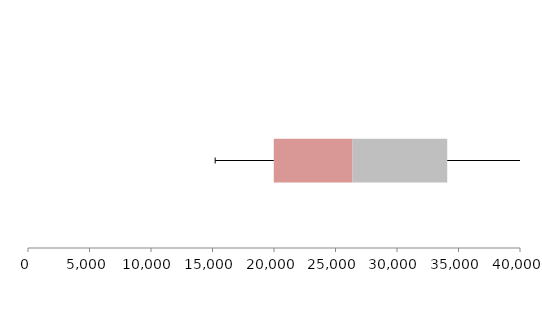
| Category | Series 1 | Series 2 | Series 3 |
|---|---|---|---|
| 0 | 19982.428 | 6405.189 | 7696.372 |